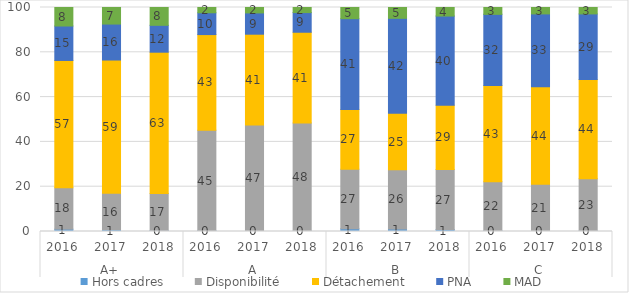
| Category | Hors cadres | Disponibilité | Détachement | PNA | MAD |
|---|---|---|---|---|---|
| 0 | 1.046 | 18.445 | 56.867 | 15.378 | 8.264 |
| 1 | 0.794 | 16.259 | 59.499 | 16.054 | 7.394 |
| 2 | 0.469 | 16.507 | 63.069 | 11.995 | 7.96 |
| 3 | 0.368 | 44.783 | 42.76 | 9.733 | 2.356 |
| 4 | 0.286 | 47.239 | 40.555 | 9.499 | 2.421 |
| 5 | 0.193 | 48.246 | 40.513 | 8.783 | 2.264 |
| 6 | 1.257 | 26.525 | 26.695 | 40.536 | 4.987 |
| 7 | 1.102 | 26.432 | 25.257 | 42.379 | 4.829 |
| 8 | 0.869 | 26.76 | 28.725 | 39.827 | 3.819 |
| 9 | 0.314 | 21.886 | 43.024 | 31.708 | 3.067 |
| 10 | 0.249 | 20.817 | 43.536 | 32.533 | 2.865 |
| 11 | 0.227 | 23.283 | 44.294 | 29.334 | 2.861 |